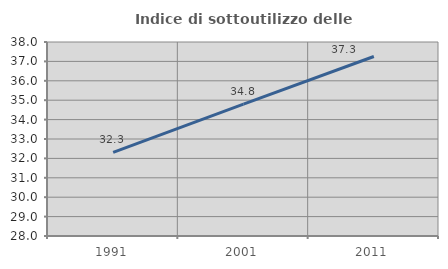
| Category | Indice di sottoutilizzo delle abitazioni  |
|---|---|
| 1991.0 | 32.312 |
| 2001.0 | 34.795 |
| 2011.0 | 37.252 |